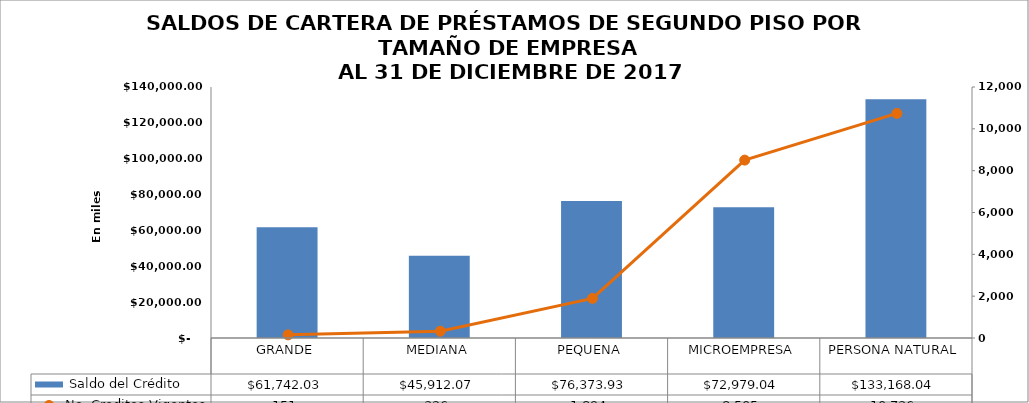
| Category |  Saldo del Crédito |
|---|---|
| GRANDE | 61742.025 |
| MEDIANA | 45912.075 |
| PEQUENA | 76373.934 |
| MICROEMPRESA | 72979.037 |
| PERSONA NATURAL | 133168.042 |